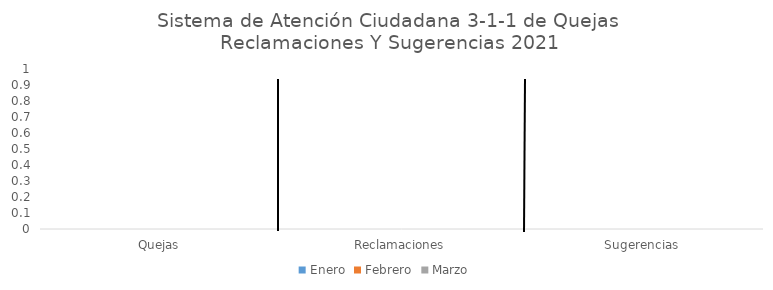
| Category | Enero | Febrero | Marzo | Abril | Mayo | Junio | Julio | Agosto | Septiembre | Octubre | Noviembre | Diciembre |
|---|---|---|---|---|---|---|---|---|---|---|---|---|
| Quejas | 0 | 0 | 0 | 0 | 0 | 0 | 0 | 0 | 0 | 0 | 0 | 0 |
| Reclamaciones | 0 | 0 | 0 | 0 | 0 | 0 | 0 | 0 | 0 | 0 | 0 | 0 |
| Sugerencias | 0 | 0 | 0 | 0 | 0 | 0 | 0 | 0 | 0 | 0 | 0 | 0 |